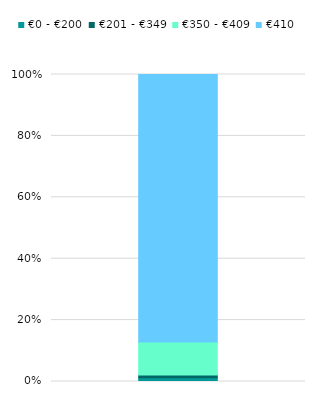
| Category | €0 - €200 | €201 - €349 | €350 - €409 | €410 |
|---|---|---|---|---|
| 0 | 0.012 | 0.009 | 0.108 | 0.871 |